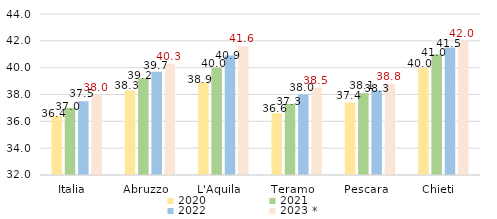
| Category | 2020   | 2021   | 2022   | 2023 *   |
|---|---|---|---|---|
| Italia   | 36.4 | 37 | 37.5 | 38 |
| Abruzzo   | 38.3 | 39.2 | 39.7 | 40.3 |
| L'Aquila   | 38.9 | 40 | 40.9 | 41.6 |
| Teramo   | 36.6 | 37.3 | 38 | 38.5 |
| Pescara   | 37.4 | 38.1 | 38.3 | 38.8 |
| Chieti   | 40 | 41 | 41.5 | 42 |